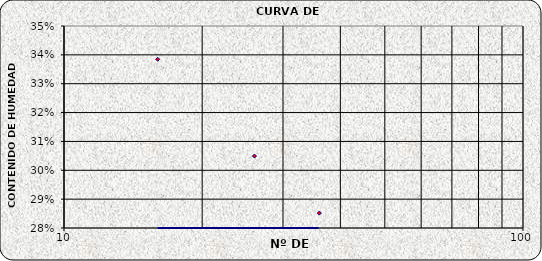
| Category | Series 0 |
|---|---|
| 36.0 | 0.285 |
| 26.0 | 0.305 |
| 16.0 | 0.338 |